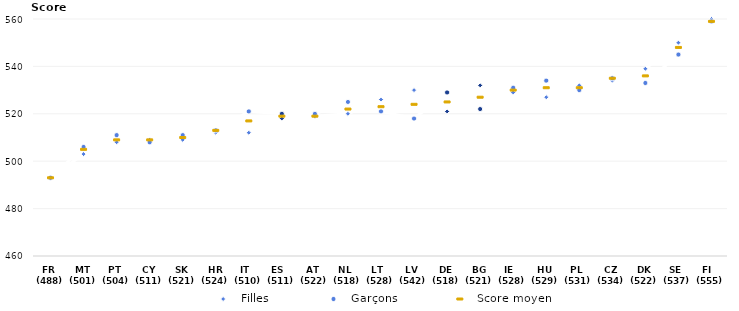
| Category | Filles | Garçons | Score moyen |
|---|---|---|---|
| FR  (488) | 493 | 493 | 493 |
| MT (501) | 503 | 506 | 505 |
| PT  (504) | 508 | 511 | 509 |
| CY (511) | 509 | 508 | 509 |
| SK (521) | 509 | 511 | 510 |
| HR (524) | 512 | 513 | 513 |
| IT   (510) | 512 | 521 | 517 |
| ES   (511) | 518 | 520 | 519 |
| AT  (522) | 519 | 520 | 519 |
| NL  (518) | 520 | 525 | 522 |
| LT   (528) | 526 | 521 | 523 |
| LV  (542) | 530 | 518 | 524 |
| DE (518) | 521 | 529 | 525 |
| BG (521) | 532 | 522 | 527 |
| IE   (528) | 529 | 531 | 530 |
| HU (529) | 527 | 534 | 531 |
| PL  (531) | 532 | 530 | 531 |
| CZ (534) | 534 | 535 | 535 |
| DK (522) | 539 | 533 | 536 |
| SE  (537) | 550 | 545 | 548 |
| FI   (555) | 560 | 559 | 559 |